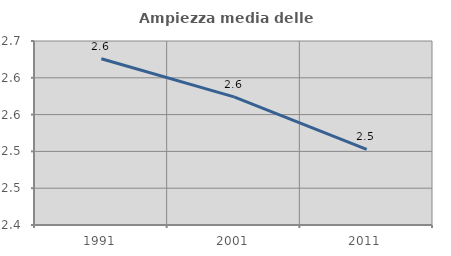
| Category | Ampiezza media delle famiglie |
|---|---|
| 1991.0 | 2.626 |
| 2001.0 | 2.574 |
| 2011.0 | 2.503 |